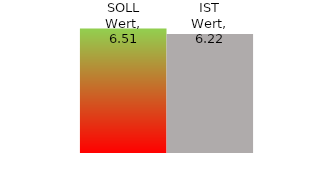
| Category | SOLL Wert | IST Wert |
|---|---|---|
| 8.5 | 6.51 | 6.22 |